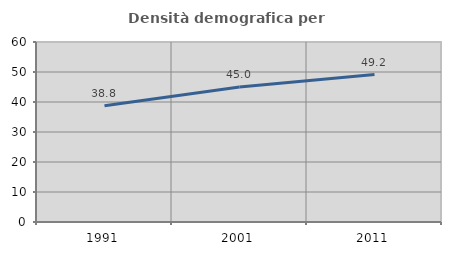
| Category | Densità demografica |
|---|---|
| 1991.0 | 38.752 |
| 2001.0 | 44.982 |
| 2011.0 | 49.159 |